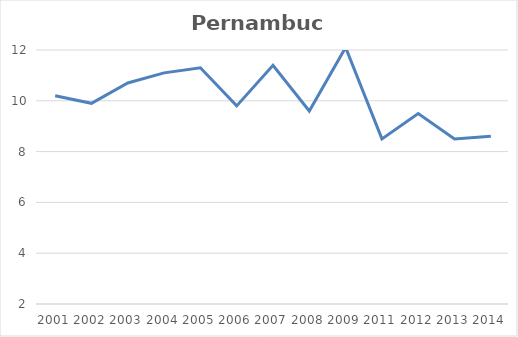
| Category | Total |
|---|---|
| 2001.0 | 10.2 |
| 2002.0 | 9.9 |
| 2003.0 | 10.7 |
| 2004.0 | 11.1 |
| 2005.0 | 11.3 |
| 2006.0 | 9.8 |
| 2007.0 | 11.4 |
| 2008.0 | 9.6 |
| 2009.0 | 12.1 |
| 2011.0 | 8.5 |
| 2012.0 | 9.5 |
| 2013.0 | 8.5 |
| 2014.0 | 8.6 |